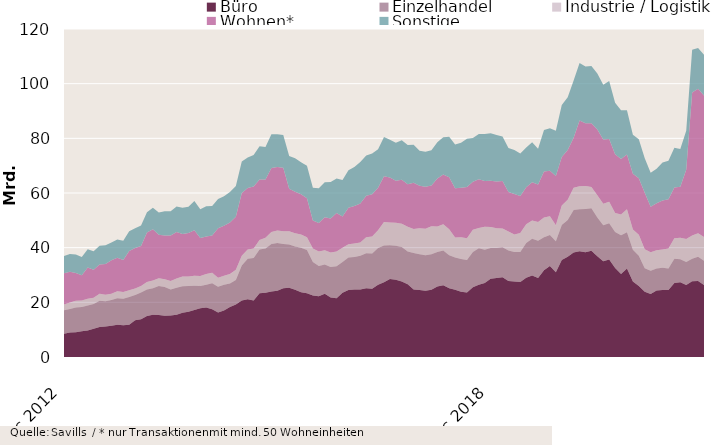
| Category | Büro | Einzelhandel | Industrie / Logistik | Wohnen* | Sonstige |
|---|---|---|---|---|---|
| 2012-12-01 | 8504321777 | 8639547669.18 | 2107652642.7 | 11384509003.96 | 6324174971.9 |
| 2013-01-01 | 8967470029 | 8597580631.17 | 2339227123.7 | 11304524746.96 | 6459749914.9 |
| 2013-02-01 | 9042734297.5 | 9076239904.85 | 2499386859.7 | 10148062276.96 | 6769163357.18 |
| 2013-03-01 | 9382899317.14 | 8879175776.35 | 2448956640.7 | 9229456528.32 | 6668642236.18 |
| 2013-04-01 | 9737865550.14 | 9085115744.35 | 2505676640.7 | 11400620541.32 | 6675635417.18 |
| 2013-05-01 | 10330473308.14 | 9039419099.35 | 2286696652.7 | 10308183683.48 | 6691277053.18 |
| 2013-06-01 | 10978757530.14 | 9577681151.78 | 2561696079.7 | 10738835935.44 | 6889015860.68 |
| 2013-07-01 | 11142986962.92 | 9286443584.78 | 2380046000.7 | 11240541620.44 | 6860571232.45 |
| 2013-08-01 | 11443046924.92 | 9376730772.8 | 2332457290 | 12229839822.44 | 6523458565.93 |
| 2013-09-01 | 11813118125.72 | 9699402869.51 | 2519207211.98 | 12284101856.74 | 6702053323.89 |
| 2013-10-01 | 11609579110.72 | 9727861863.57 | 2441069185.98 | 11727008984.54 | 6999037430.89 |
| 2013-11-01 | 11823434614.72 | 10122530032.36 | 2430937190.98 | 14361489005.63 | 7242529719.86 |
| 2013-12-01 | 13486314866.72 | 9187102030.91 | 2347240569.98 | 14839189260.74 | 7207107913.45 |
| 2014-01-01 | 13780730877.72 | 9851068493.92 | 2318485717.98 | 14690274441.74 | 7445499336.45 |
| 2014-02-01 | 15007305331.22 | 9673463303.24 | 2768349976.98 | 18105536458.24 | 7410903668.17 |
| 2014-03-01 | 15491487872.58 | 9654351125.74 | 2833117356.98 | 18788331922.24 | 7865305632.17 |
| 2014-04-01 | 15374141977.58 | 10607660669.74 | 2834100536.98 | 15912594110.24 | 8156058838.17 |
| 2014-05-01 | 15060894833.58 | 10546963482.24 | 2845864408.98 | 15985891426.24 | 8912269938.17 |
| 2014-06-01 | 15158218425.66 | 9544432647.24 | 3105506584.98 | 16600111315.18 | 8957481288.38 |
| 2014-07-01 | 15478732963.88 | 9841966235.24 | 3440852401.98 | 16949735532.68 | 9348736034.61 |
| 2014-08-01 | 16232650242.88 | 9636967715.24 | 3573059549.98 | 15601635374.68 | 9537173270.13 |
| 2014-09-01 | 16583059928.08 | 9353804856.84 | 3506391505.5 | 15963260713.68 | 9536363131.17 |
| 2014-10-01 | 17213987967.08 | 8866837530.84 | 3656699955.5 | 16628034819.88 | 10688452074.17 |
| 2014-11-01 | 17844374967.08 | 8117398128.05 | 3665328905.5 | 13878849559.89 | 10536862158.2 |
| 2014-12-01 | 18081725689.74 | 8390279963.03 | 3920968980.31 | 13670541413.41 | 11111775796.81 |
| 2015-01-01 | 17480642203.74 | 9466254593.03 | 3883908572.31 | 13646785050.41 | 10792640236.82 |
| 2015-02-01 | 16274240230.74 | 9403790983.81 | 3308490268.73 | 18150436996.91 | 10711659377.05 |
| 2015-03-01 | 17035308030.53 | 9365302106.81 | 3368654245.73 | 18257100941.91 | 10814665093.98 |
| 2015-04-01 | 18258922782.53 | 8632001669.81 | 3468694360.68 | 18830450268.91 | 11160418925.98 |
| 2015-05-01 | 19244040473.45 | 8968092469.31 | 3728635607.68 | 19401993150.91 | 11206086418.98 |
| 2015-06-01 | 20628774084.83 | 12835460483.14 | 3559231021.83 | 22972449786.51 | 11551008084.75 |
| 2015-07-01 | 21112087532.5 | 14845940919.21 | 3371725415.86 | 22540107592.35 | 11120198096.21 |
| 2015-08-01 | 20695261632.5 | 15562941505.21 | 3450767146.86 | 22635118357.35 | 11596269263.21 |
| 2015-09-01 | 23317313452.46 | 16001092585.73 | 3520511283.36 | 22065141963.35 | 12239394888.21 |
| 2015-10-01 | 23516812856.46 | 16181040556.36 | 3919085482.36 | 21292965650.35 | 11947737369.21 |
| 2015-11-01 | 23972463618.14 | 17339041737.5 | 4397719316.13 | 23395398176.29 | 12403799285.38 |
| 2015-12-01 | 24223428696.48 | 17455198961.04 | 4557113724.92 | 23319336016.77 | 11921836396.75 |
| 2016-01-01 | 25174915627.48 | 16138997225.45 | 4662502872.92 | 23277671921.77 | 11967817247.24 |
| 2016-02-01 | 25329929348.53 | 15820090497.99 | 4833139363.87 | 15563498654.77 | 11947811922.01 |
| 2016-03-01 | 24570059201.74 | 15865699828.72 | 4877967507.07 | 15108592339.77 | 12258738527.08 |
| 2016-04-01 | 23703143104.74 | 16254770286.07 | 4833846127.82 | 14760671477.37 | 11696815742.08 |
| 2016-05-01 | 23294206506.82 | 15809944380.07 | 4749671116.82 | 14232081715.37 | 11919414936.04 |
| 2016-06-01 | 22501572843.36 | 12232494883.06 | 4999570420.67 | 10189436595.87 | 11965206341.06 |
| 2016-07-01 | 22191433924.69 | 11125435985.56 | 5312245465.64 | 10404072475.53 | 12714721035.96 |
| 2016-08-01 | 23095572073.69 | 10745638868.56 | 5247332254.55 | 12050427222.53 | 12760471635.96 |
| 2016-09-01 | 21794742253.73 | 11145401725.47 | 5270185116.55 | 12465620399.13 | 13320393986.26 |
| 2016-10-01 | 21450269446.86 | 11739208168.84 | 5398267322.55 | 14070034790.02 | 12669133056.83 |
| 2016-11-01 | 23506003086.76 | 11238716740.7 | 5243284144.73 | 11380146617.09 | 13425196679.66 |
| 2016-12-01 | 24468092228.4 | 11930870429.99 | 4886851002.13 | 13331201908.09 | 13681375420.64 |
| 2017-01-01 | 24675768593.4 | 11942263686.96 | 4921244810.37 | 13729696509.09 | 14250866691.58 |
| 2017-02-01 | 24713389622.41 | 12356472437.09 | 4839285725 | 14267858145.09 | 15185668584.58 |
| 2017-03-01 | 25170261511.4 | 12765732178.37 | 5896154543.8 | 15167920484.39 | 14747708325.58 |
| 2017-04-01 | 25008250661.71 | 12830910576.9 | 6258560580.1 | 15489114794.79 | 14851969486.67 |
| 2017-05-01 | 26420856083.47 | 13492885630.15 | 6480202097.1 | 15522287182.8 | 14083438590.28 |
| 2017-06-01 | 27359198504.1 | 13451943478.5 | 8559046401.46 | 16801850396.39 | 14298214208.56 |
| 2017-07-01 | 28566083298.1 | 12300139347.93 | 8320632158.46 | 16480355706.39 | 13778769706.2 |
| 2017-08-01 | 28285172977.1 | 12408029136.93 | 8383195707.55 | 15442529308.39 | 13849134751.2 |
| 2017-09-01 | 27607830483.45 | 12616830917.94 | 8506558041.55 | 16123359085.78 | 14486501554.74 |
| 2017-10-01 | 26661153964.32 | 11909960273.94 | 9044546430.46 | 15580068614.87 | 14351240861.17 |
| 2017-11-01 | 24728535385.17 | 13314421843.83 | 8799447546.51 | 16947694524.87 | 13849490657.44 |
| 2017-12-01 | 24513417630.53 | 13078578236.48 | 9470343512.7 | 15610704960.87 | 12759017527.48 |
| 2018-01-01 | 24219024273.53 | 13013700645.1 | 9721702683.46 | 15307451168.86 | 12872295093.04 |
| 2018-02-01 | 24590947510.47 | 12985537030.65 | 10213193365.46 | 14917009796.86 | 12890336189.04 |
| 2018-03-01 | 25772438266.48 | 12663577036.64 | 9307934893.46 | 17524767231.49 | 13297726597.02 |
| 2018-04-01 | 26239260459.17 | 12722345110.76 | 9605919650.46 | 18204136136.49 | 13654710808.93 |
| 2018-05-01 | 25176840173.41 | 12092663746.51 | 9488564046.46 | 19015064846.48 | 14830516074.36 |
| 2018-06-01 | 24619805985.78 | 11810463263.34 | 7330050155.1 | 17955943579.56 | 16022655962.08 |
| 2018-07-01 | 23897232823.78 | 11960863126.32 | 7966869588.1 | 18082211683.56 | 16514108766.19 |
| 2018-08-01 | 23631217227.76 | 11885701905.19 | 7898300709.1 | 18779877058.41 | 17667527641.04 |
| 2018-09-01 | 25478200690.41 | 12927853979.55 | 8136141438.1 | 17594307591.42 | 15998426541.21 |
| 2018-10-01 | 26428322940.41 | 13398765782.82 | 7412735586.25 | 17806279798.32 | 16500489800.21 |
| 2018-11-01 | 27102721403.45 | 12145908934.88 | 8401198728.54 | 16739676352.32 | 17199430194.25 |
| 2018-12-01 | 28655175031.45 | 11248285254.68 | 7673095490.35 | 16903534102.32 | 17410832515.26 |
| 2019-01-01 | 28881677192.45 | 10984616615.68 | 7220623719.35 | 17089851283.2 | 17011641609.26 |
| 2019-02-01 | 29153984861.45 | 10992187442.4 | 6837562259.96 | 17443099230.2 | 16288670799.62 |
| 2019-03-01 | 27779834171.45 | 11171202657.26 | 6991519187.16 | 14403850111.27 | 16138588186.64 |
| 2019-04-01 | 27660063728.31 | 10721779269.12 | 6440787186.06 | 14819462716.14 | 16122027674.89 |
| 2019-05-01 | 27411606224.31 | 11007377577.12 | 6930931752.06 | 13546461129.14 | 15591702370.89 |
| 2019-06-01 | 28981375466.82 | 12738169920.09 | 6808322697.06 | 13582021303.47 | 14498193682.96 |
| 2019-07-01 | 29836478466.29 | 13385300761.26 | 6721738121.06 | 13965040868.47 | 14698594837.92 |
| 2019-08-01 | 28932944882.31 | 13638029313.39 | 6847156982.06 | 13700485358.62 | 13056753149.07 |
| 2019-09-01 | 31740495687.25 | 12091023494.97 | 7236155171.92 | 16808223801.62 | 15208053471.17 |
| 2019-10-01 | 33266807249.25 | 11371608887.7 | 6870917898.86 | 16650274404.74 | 15543023722.17 |
| 2019-11-01 | 30998345096.78 | 11335647756.75 | 5862593126.57 | 17999098699.74 | 16608257247.86 |
| 2019-12-01 | 35527691128.49 | 12748435551.88 | 7193076149.23 | 17715667348.74 | 18988776442.82 |
| 2020-01-01 | 36701466860.49 | 13455205119.88 | 7418333450.23 | 18152920102.87 | 19298443060.82 |
| 2020-02-01 | 38253570613.44 | 15518583828.37 | 8118849336.38 | 18347811221.37 | 20876955510.54 |
| 2020-03-01 | 38661114818.89 | 15361758647.15 | 8435638262.18 | 24034093487.37 | 21087830921.12 |
| 2020-04-01 | 38306762938.03 | 15876632879.17 | 8421581433.28 | 22892151936.5 | 20818918971.87 |
| 2020-05-01 | 38874029574.03 | 15517202993.17 | 7833704033.28 | 23320141777.5 | 20907392846.83 |
| 2020-06-01 | 36825932126.52 | 14166673820.21 | 8153642308.28 | 24041398462.5 | 20572849639.76 |
| 2020-07-01 | 35038901674.05 | 13206002556.06 | 7858106953.28 | 23454894941.5 | 20046619490.06 |
| 2020-08-01 | 35631965111.05 | 13340195992.06 | 7864692000.28 | 22961788157.5 | 21150990421.55 |
| 2020-09-01 | 32515990383.11 | 13251359673.68 | 6961195944.42 | 21430453702.49 | 18831855953.08 |
| 2020-10-01 | 30357242112.11 | 14173883253.68 | 7625238129.42 | 20314229725.49 | 17841894371.54 |
| 2020-11-01 | 32387193464.11 | 13264654126.68 | 8422802908.42 | 20031748385.49 | 16141331591.98 |
| 2020-12-01 | 27661146779.4 | 11619042101.74 | 7340810853.76 | 20448638435.49 | 14201491952.88 |
| 2021-01-01 | 25978755162.4 | 11039497747.74 | 7676907719.76 | 20665419315.49 | 14332310879.79 |
| 2021-02-01 | 23889111055.45 | 8570163915.53 | 6938860723 | 20669874697.99 | 12688701255.47 |
| 2021-03-01 | 23068337137 | 8479014457.89 | 6789691146.99 | 16605782848.99 | 12424705480.25 |
| 2021-04-01 | 24325317320 | 8069753506.01 | 6669014867.99 | 17153757013.99 | 12650159254.25 |
| 2021-05-01 | 24472986088 | 8203956491.01 | 6688135128.99 | 17918074016.99 | 13865997709.29 |
| 2021-06-01 | 24539689945 | 7841565938 | 7330984208.99 | 17984130212.99 | 14137028508.91 |
| 2021-07-01 | 27110626580 | 8811276187 | 7562676605.99 | 18543759487.74 | 14549275910.54 |
| 2021-08-01 | 27345698655 | 8408714112 | 7850085331.96 | 18659329563.74 | 13804286223.05 |
| 2021-09-01 | 26302195977 | 8481091780.91 | 8390306330.96 | 25369592846.75 | 14276036303.41 |
| 2021-10-01 | 27689609424.69 | 8232227143.91 | 8537942460.96 | 52340700967.75 | 15574634646.32 |
| 2021-11-01 | 27834406022.69 | 8817119107.91 | 8590090134.96 | 52915596408.75 | 14869795688.88 |
| 2021-12-01 | 26360286331.69 | 8890621408.91 | 8643636061.96 | 51790477388.25 | 14906533482.02 |